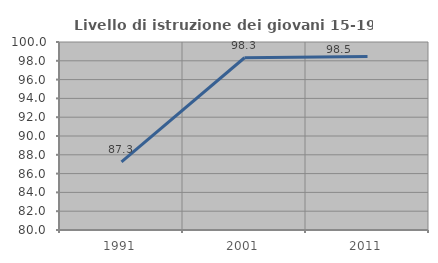
| Category | Livello di istruzione dei giovani 15-19 anni |
|---|---|
| 1991.0 | 87.255 |
| 2001.0 | 98.324 |
| 2011.0 | 98.462 |